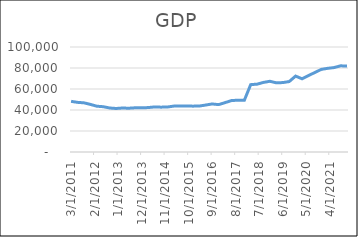
| Category | GDP |
|---|---|
| 3/31/11 | 48261 |
| 6/30/11 | 47274 |
| 9/30/11 | 46843 |
| 12/31/11 | 45356 |
| 3/31/12 | 43626 |
| 6/30/12 | 43142 |
| 9/30/12 | 41920 |
| 12/31/12 | 41441 |
| 3/31/13 | 41892 |
| 6/30/13 | 41697 |
| 9/30/13 | 42113 |
| 12/31/13 | 42039 |
| 3/31/14 | 42314 |
| 6/30/14 | 42905 |
| 9/30/14 | 42719 |
| 12/31/14 | 42829 |
| 3/31/15 | 43716 |
| 6/30/15 | 43764 |
| 9/30/15 | 43789 |
| 12/31/15 | 43674 |
| 3/31/16 | 43778 |
| 6/30/16 | 44742 |
| 9/30/16 | 45744 |
| 12/31/16 | 45128 |
| 3/31/17 | 47002 |
| 6/30/17 | 48996 |
| 9/30/17 | 49322 |
| 12/31/17 | 49188 |
| 3/31/18 | 64163 |
| 6/30/18 | 64614 |
| 9/30/18 | 66302 |
| 12/31/18 | 67335 |
| 3/31/19 | 65871 |
| 6/30/19 | 66117 |
| 9/30/19 | 67087 |
| 12/31/19 | 72303 |
| 3/31/20 | 69717 |
| 6/30/20 | 72793 |
| 9/30/20 | 75712 |
| 12/31/20 | 78664 |
| 3/31/21 | 79676 |
| 6/30/21 | 80418 |
| 9/30/21 | 82048 |
| 12/31/21 | 81948 |